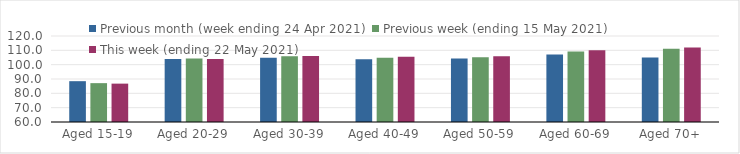
| Category | Previous month (week ending 24 Apr 2021) | Previous week (ending 15 May 2021) | This week (ending 22 May 2021) |
|---|---|---|---|
| Aged 15-19 | 88.48 | 87.11 | 86.77 |
| Aged 20-29 | 103.93 | 104.22 | 103.9 |
| Aged 30-39 | 104.74 | 105.82 | 105.98 |
| Aged 40-49 | 103.82 | 104.86 | 105.5 |
| Aged 50-59 | 104.34 | 105.16 | 105.86 |
| Aged 60-69 | 107.12 | 109.19 | 109.99 |
| Aged 70+ | 104.98 | 111.04 | 112.05 |